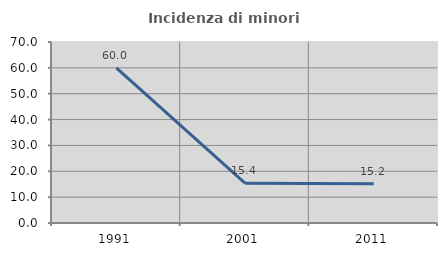
| Category | Incidenza di minori stranieri |
|---|---|
| 1991.0 | 60 |
| 2001.0 | 15.385 |
| 2011.0 | 15.152 |